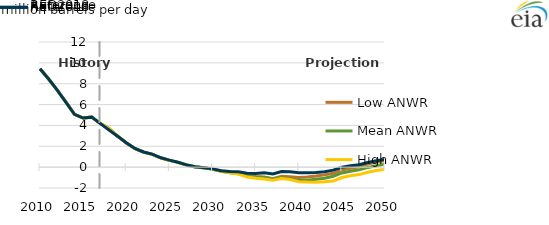
| Category | Low ANWR | Mean ANWR | High ANWR | AEO2018 Reference  |
|---|---|---|---|---|
| 2010.0 | 9.433 | 9.433 | 9.433 | 9.433 |
| 2011.0 | 8.45 | 8.45 | 8.45 | 8.45 |
| 2012.0 | 7.394 | 7.394 | 7.394 | 7.394 |
| 2013.0 | 6.237 | 6.237 | 6.237 | 6.237 |
| 2014.0 | 5.065 | 5.065 | 5.065 | 5.065 |
| 2015.0 | 4.711 | 4.711 | 4.711 | 4.711 |
| 2016.0 | 4.793 | 4.793 | 4.793 | 4.793 |
| 2017.0 | 4.177 | 4.177 | 4.177 | 4.177 |
| 2018.0 | 3.703 | 3.705 | 3.705 | 3.562 |
| 2019.0 | 2.961 | 2.964 | 2.979 | 2.969 |
| 2020.0 | 2.324 | 2.328 | 2.335 | 2.335 |
| 2021.0 | 1.781 | 1.785 | 1.795 | 1.794 |
| 2022.0 | 1.439 | 1.444 | 1.446 | 1.456 |
| 2023.0 | 1.233 | 1.224 | 1.23 | 1.246 |
| 2024.0 | 0.886 | 0.883 | 0.874 | 0.897 |
| 2025.0 | 0.649 | 0.652 | 0.658 | 0.671 |
| 2026.0 | 0.457 | 0.462 | 0.461 | 0.473 |
| 2027.0 | 0.2 | 0.2 | 0.218 | 0.214 |
| 2028.0 | 0.02 | 0.021 | 0.036 | 0.04 |
| 2029.0 | -0.068 | -0.063 | -0.05 | -0.049 |
| 2030.0 | -0.181 | -0.195 | -0.165 | -0.166 |
| 2031.0 | -0.369 | -0.389 | -0.388 | -0.343 |
| 2032.0 | -0.474 | -0.538 | -0.54 | -0.424 |
| 2033.0 | -0.562 | -0.645 | -0.657 | -0.45 |
| 2034.0 | -0.796 | -0.862 | -0.944 | -0.589 |
| 2035.0 | -0.896 | -0.949 | -1.067 | -0.613 |
| 2036.0 | -0.952 | -0.983 | -1.138 | -0.536 |
| 2037.0 | -1.102 | -1.139 | -1.265 | -0.654 |
| 2038.0 | -0.873 | -1.01 | -1.098 | -0.423 |
| 2039.0 | -0.924 | -1.12 | -1.193 | -0.453 |
| 2040.0 | -1.002 | -1.255 | -1.391 | -0.546 |
| 2041.0 | -0.948 | -1.26 | -1.426 | -0.541 |
| 2042.0 | -0.858 | -1.165 | -1.439 | -0.513 |
| 2043.0 | -0.741 | -1.062 | -1.39 | -0.436 |
| 2044.0 | -0.588 | -0.875 | -1.339 | -0.29 |
| 2045.0 | -0.273 | -0.559 | -0.995 | -0.013 |
| 2046.0 | -0.109 | -0.387 | -0.835 | 0.129 |
| 2047.0 | 0.044 | -0.26 | -0.715 | 0.224 |
| 2048.0 | 0.299 | -0.026 | -0.494 | 0.444 |
| 2049.0 | 0.49 | 0.137 | -0.331 | 0.618 |
| 2050.0 | 0.633 | 0.302 | -0.217 | 0.749 |